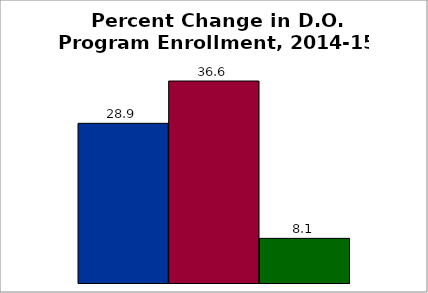
| Category | 50 states and D.C. | SREB states | State |
|---|---|---|---|
| 0 | 28.9 | 36.558 | 8.079 |